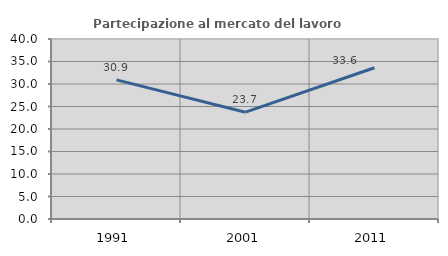
| Category | Partecipazione al mercato del lavoro  femminile |
|---|---|
| 1991.0 | 30.912 |
| 2001.0 | 23.735 |
| 2011.0 | 33.61 |